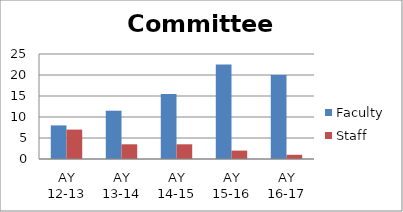
| Category | Faculty | Staff |
|---|---|---|
| AY 12-13 | 8 | 7 |
| AY 13-14 | 11.5 | 3.5 |
| AY 14-15 | 15.5 | 3.5 |
| AY 15-16 | 22.5 | 2 |
| AY 16-17 | 20 | 1 |